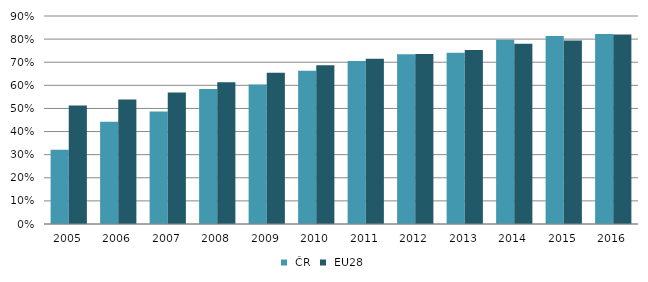
| Category |  ČR |  EU28 |
|---|---|---|
| 2005.0 | 0.321 | 0.513 |
| 2006.0 | 0.443 | 0.538 |
| 2007.0 | 0.486 | 0.569 |
| 2008.0 | 0.584 | 0.614 |
| 2009.0 | 0.604 | 0.654 |
| 2010.0 | 0.664 | 0.687 |
| 2011.0 | 0.705 | 0.715 |
| 2012.0 | 0.734 | 0.736 |
| 2013.0 | 0.741 | 0.753 |
| 2014.0 | 0.797 | 0.78 |
| 2015.0 | 0.813 | 0.794 |
| 2016.0 | 0.822 | 0.82 |